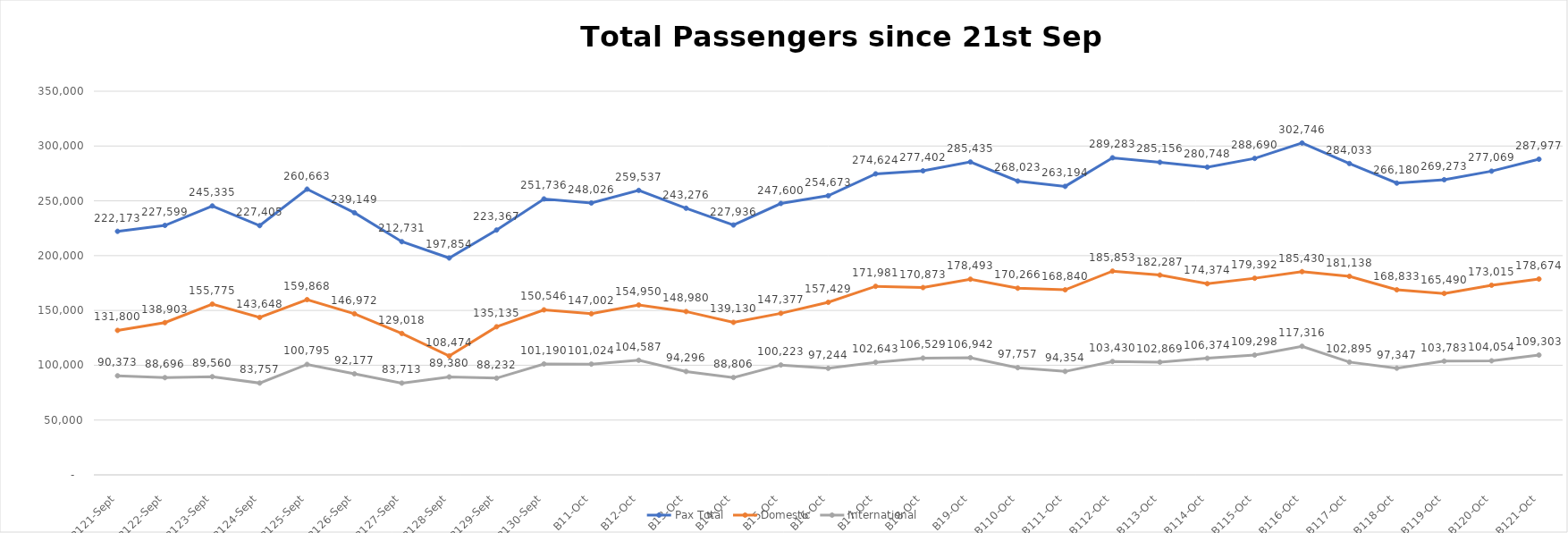
| Category | Pax Total |  Domestic  |  International  |
|---|---|---|---|
| 2022-09-21 | 222173 | 131800 | 90373 |
| 2022-09-22 | 227599 | 138903 | 88696 |
| 2022-09-23 | 245335 | 155775 | 89560 |
| 2022-09-24 | 227405 | 143648 | 83757 |
| 2022-09-25 | 260663 | 159868 | 100795 |
| 2022-09-26 | 239149 | 146972 | 92177 |
| 2022-09-27 | 212731 | 129018 | 83713 |
| 2022-09-28 | 197854 | 108474 | 89380 |
| 2022-09-29 | 223367 | 135135 | 88232 |
| 2022-09-30 | 251736 | 150546 | 101190 |
| 2022-10-01 | 248026 | 147002 | 101024 |
| 2022-10-02 | 259537 | 154950 | 104587 |
| 2022-10-03 | 243276 | 148980 | 94296 |
| 2022-10-04 | 227936 | 139130 | 88806 |
| 2022-10-05 | 247600 | 147377 | 100223 |
| 2022-10-06 | 254673 | 157429 | 97244 |
| 2022-10-07 | 274624 | 171981 | 102643 |
| 2022-10-08 | 277402 | 170873 | 106529 |
| 2022-10-09 | 285435 | 178493 | 106942 |
| 2022-10-10 | 268023 | 170266 | 97757 |
| 2022-10-11 | 263194 | 168840 | 94354 |
| 2022-10-12 | 289283 | 185853 | 103430 |
| 2022-10-13 | 285156 | 182287 | 102869 |
| 2022-10-14 | 280748 | 174374 | 106374 |
| 2022-10-15 | 288690 | 179392 | 109298 |
| 2022-10-16 | 302746 | 185430 | 117316 |
| 2022-10-17 | 284033 | 181138 | 102895 |
| 2022-10-18 | 266180 | 168833 | 97347 |
| 2022-10-19 | 269273 | 165490 | 103783 |
| 2022-10-20 | 277069 | 173015 | 104054 |
| 2022-10-21 | 287977 | 178674 | 109303 |